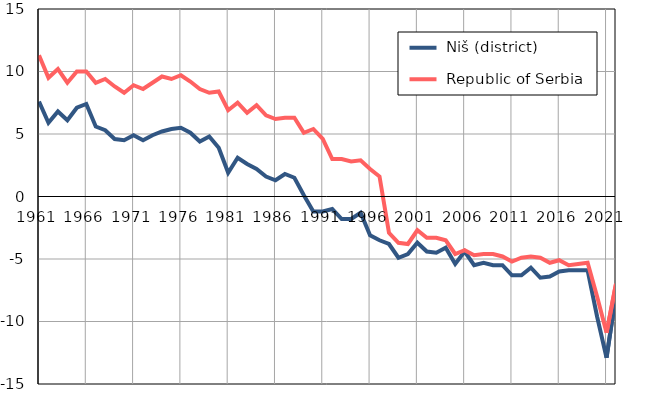
| Category |  Niš (district) |  Republic of Serbia |
|---|---|---|
| 1961.0 | 7.6 | 11.3 |
| 1962.0 | 5.9 | 9.5 |
| 1963.0 | 6.8 | 10.2 |
| 1964.0 | 6.1 | 9.1 |
| 1965.0 | 7.1 | 10 |
| 1966.0 | 7.4 | 10 |
| 1967.0 | 5.6 | 9.1 |
| 1968.0 | 5.3 | 9.4 |
| 1969.0 | 4.6 | 8.8 |
| 1970.0 | 4.5 | 8.3 |
| 1971.0 | 4.9 | 8.9 |
| 1972.0 | 4.5 | 8.6 |
| 1973.0 | 4.9 | 9.1 |
| 1974.0 | 5.2 | 9.6 |
| 1975.0 | 5.4 | 9.4 |
| 1976.0 | 5.5 | 9.7 |
| 1977.0 | 5.1 | 9.2 |
| 1978.0 | 4.4 | 8.6 |
| 1979.0 | 4.8 | 8.3 |
| 1980.0 | 3.9 | 8.4 |
| 1981.0 | 1.9 | 6.9 |
| 1982.0 | 3.1 | 7.5 |
| 1983.0 | 2.6 | 6.7 |
| 1984.0 | 2.2 | 7.3 |
| 1985.0 | 1.6 | 6.5 |
| 1986.0 | 1.3 | 6.2 |
| 1987.0 | 1.8 | 6.3 |
| 1988.0 | 1.5 | 6.3 |
| 1989.0 | 0.1 | 5.1 |
| 1990.0 | -1.2 | 5.4 |
| 1991.0 | -1.2 | 4.6 |
| 1992.0 | -1 | 3 |
| 1993.0 | -1.8 | 3 |
| 1994.0 | -1.8 | 2.8 |
| 1995.0 | -1.3 | 2.9 |
| 1996.0 | -3.1 | 2.2 |
| 1997.0 | -3.5 | 1.6 |
| 1998.0 | -3.8 | -2.9 |
| 1999.0 | -4.9 | -3.7 |
| 2000.0 | -4.6 | -3.8 |
| 2001.0 | -3.7 | -2.7 |
| 2002.0 | -4.4 | -3.3 |
| 2003.0 | -4.5 | -3.3 |
| 2004.0 | -4.1 | -3.5 |
| 2005.0 | -5.4 | -4.6 |
| 2006.0 | -4.4 | -4.3 |
| 2007.0 | -5.5 | -4.7 |
| 2008.0 | -5.3 | -4.6 |
| 2009.0 | -5.5 | -4.6 |
| 2010.0 | -5.5 | -4.8 |
| 2011.0 | -6.3 | -5.2 |
| 2012.0 | -6.3 | -4.9 |
| 2013.0 | -5.7 | -4.8 |
| 2014.0 | -6.5 | -4.9 |
| 2015.0 | -6.4 | -5.3 |
| 2016.0 | -6 | -5.1 |
| 2017.0 | -5.9 | -5.5 |
| 2018.0 | -5.9 | -5.4 |
| 2019.0 | -5.9 | -5.3 |
| 2020.0 | -9.6 | -8 |
| 2021.0 | -12.9 | -10.9 |
| 2022.0 | -7.8 | -7 |